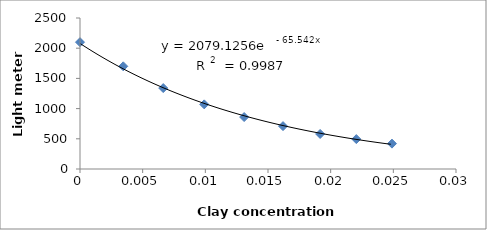
| Category | Series 0 |
|---|---|
| 0.0 | 2100 |
| 0.0034516765285996054 | 1700 |
| 0.006640244750382423 | 1340 |
| 0.009912196460419812 | 1070 |
| 0.013097333152836064 | 860 |
| 0.016199064796259186 | 710 |
| 0.019159741458910435 | 580 |
| 0.022046372280838868 | 495 |
| 0.024890661178286595 | 420 |